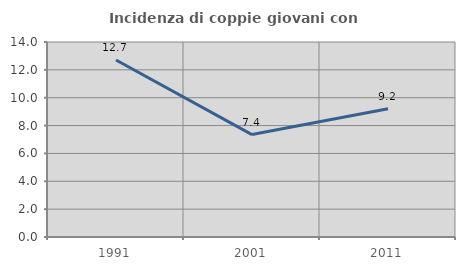
| Category | Incidenza di coppie giovani con figli |
|---|---|
| 1991.0 | 12.712 |
| 2001.0 | 7.353 |
| 2011.0 | 9.211 |